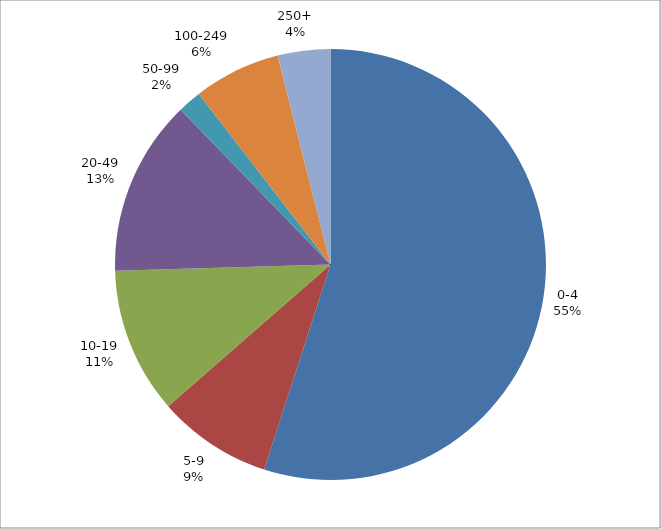
| Category | Series 0 |
|---|---|
| 0-4 | 557 |
| 5-9 | 87 |
| 10-19 | 111 |
| 20-49 | 134 |
| 50-99 | 18 |
| 100-249 | 66 |
| 250+ | 40 |